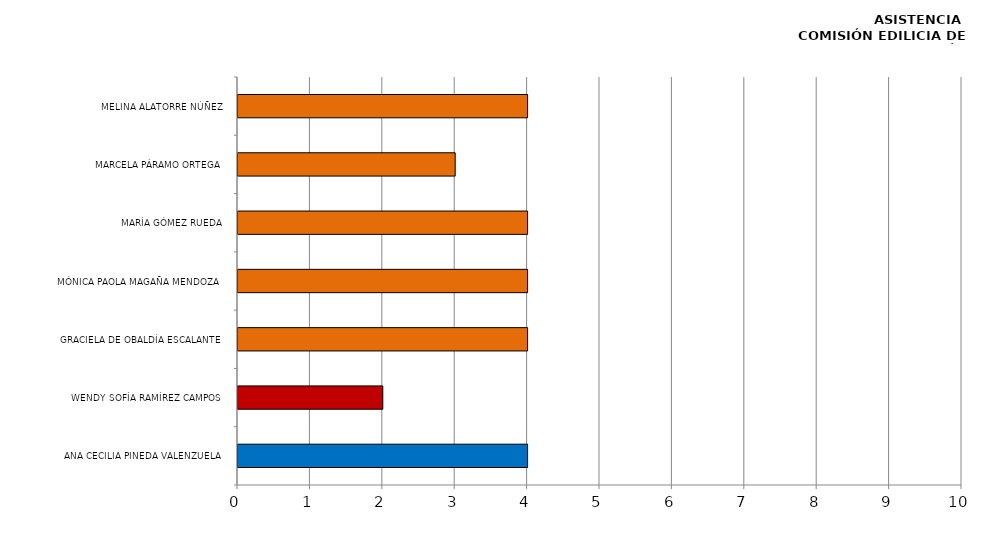
| Category | Series 0 |
|---|---|
| ANA CECILIA PINEDA VALENZUELA | 4 |
| WENDY SOFÍA RAMÍREZ CAMPOS | 2 |
| GRACIELA DE OBALDÍA ESCALANTE | 4 |
| MÓNICA PAOLA MAGAÑA MENDOZA | 4 |
| MARÍA GÓMEZ RUEDA | 4 |
| MARCELA PÁRAMO ORTEGA | 3 |
| MELINA ALATORRE NÚÑEZ | 4 |